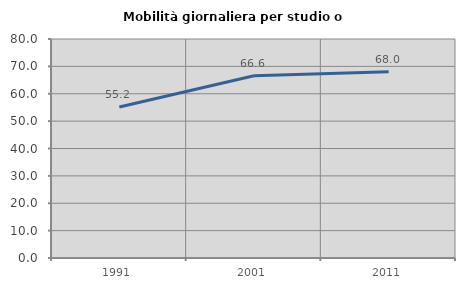
| Category | Mobilità giornaliera per studio o lavoro |
|---|---|
| 1991.0 | 55.161 |
| 2001.0 | 66.571 |
| 2011.0 | 68.011 |